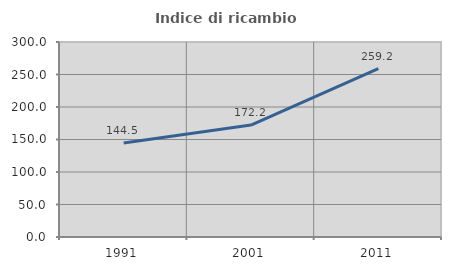
| Category | Indice di ricambio occupazionale  |
|---|---|
| 1991.0 | 144.545 |
| 2001.0 | 172.222 |
| 2011.0 | 259.2 |